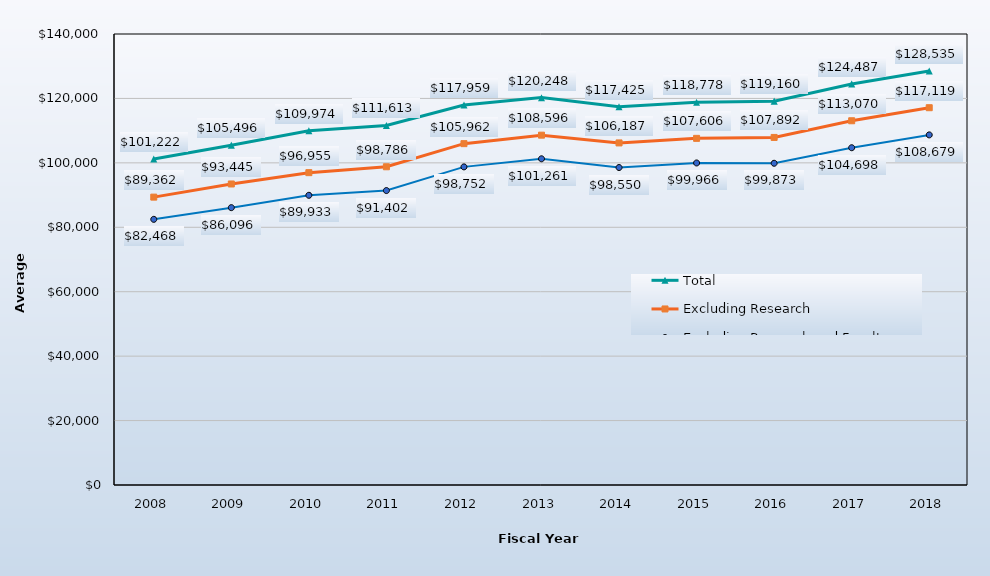
| Category | Total | Excluding Research | Excluding Research and Faculty Practice |
|---|---|---|---|
| 2008.0 | 101222 | 89362 | 82468 |
| 2009.0 | 105496 | 93445 | 86096 |
| 2010.0 | 109974 | 96955 | 89933 |
| 2011.0 | 111613 | 98786 | 91402 |
| 2012.0 | 117959 | 105962 | 98752 |
| 2013.0 | 120248 | 108596 | 101261 |
| 2014.0 | 117425 | 106187 | 98550 |
| 2015.0 | 118778 | 107606 | 99966 |
| 2016.0 | 119160 | 107892 | 99873 |
| 2017.0 | 124487 | 113070 | 104698 |
| 2018.0 | 128535 | 117119 | 108679 |